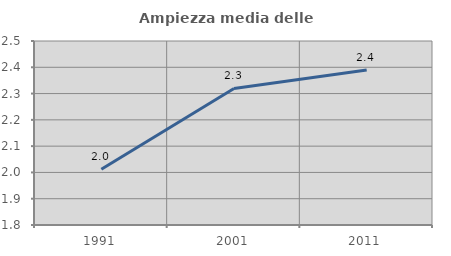
| Category | Ampiezza media delle famiglie |
|---|---|
| 1991.0 | 2.012 |
| 2001.0 | 2.319 |
| 2011.0 | 2.39 |